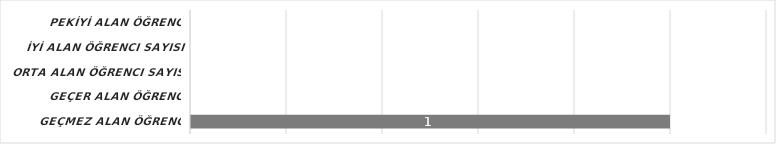
| Category | Series 6 |
|---|---|
| GEÇMEZ alan öğrenci sayısı | 1 |
| GEÇER alan öğrenci sayısı | 0 |
| ORTA alan öğrenci sayısı | 0 |
| İYİ alan öğrenci sayısı | 0 |
| PEKİYİ alan öğrenci sayısı | 0 |